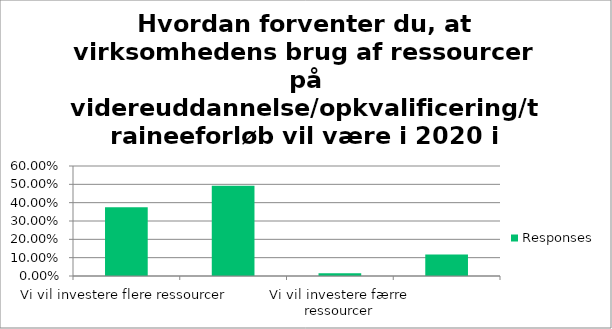
| Category | Responses |
|---|---|
| Vi vil investere flere ressourcer | 0.374 |
| Vi vil investere samme ressourcer | 0.492 |
| Vi vil investere færre ressourcer | 0.015 |
| Ved ikke | 0.118 |